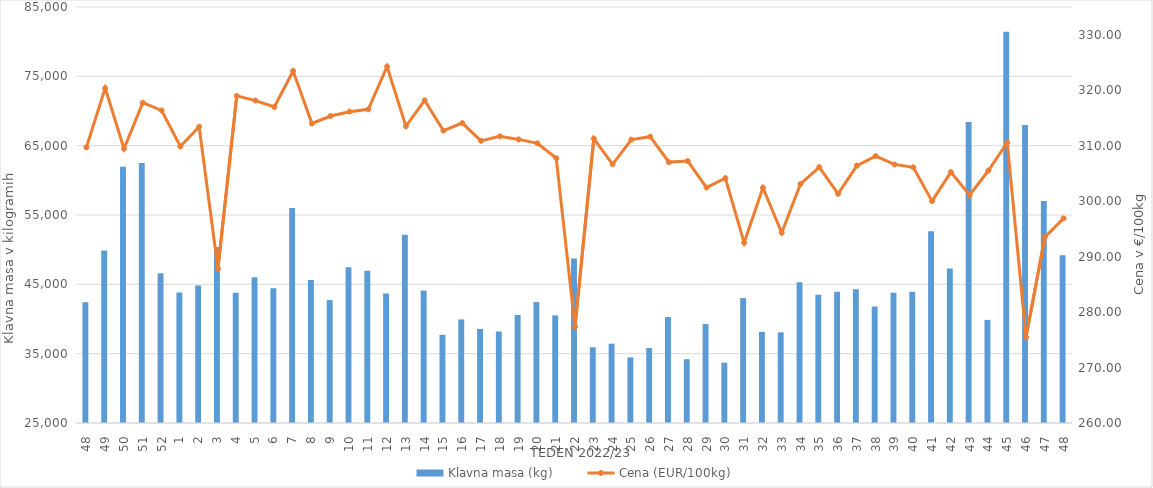
| Category | Klavna masa (kg) |
|---|---|
| 48.0 | 42416 |
| 49.0 | 49873 |
| 50.0 | 61942 |
| 51.0 | 62514 |
| 52.0 | 46589 |
| 1.0 | 43807 |
| 2.0 | 44834 |
| 3.0 | 50386 |
| 4.0 | 43773 |
| 5.0 | 46011 |
| 6.0 | 44439 |
| 7.0 | 56001 |
| 8.0 | 45613 |
| 9.0 | 42730 |
| 10.0 | 47471 |
| 11.0 | 46952 |
| 12.0 | 43683 |
| 13.0 | 52135 |
| 14.0 | 44103 |
| 15.0 | 37719 |
| 16.0 | 39943 |
| 17.0 | 38574 |
| 18.0 | 38200 |
| 19.0 | 40581 |
| 20.0 | 42443 |
| 21.0 | 40517 |
| 22.0 | 48742 |
| 23.0 | 35927 |
| 24.0 | 36436 |
| 25.0 | 34463 |
| 26.0 | 35812 |
| 27.0 | 40280 |
| 28.0 | 34201 |
| 29.0 | 39279 |
| 30.0 | 33702 |
| 31.0 | 43020 |
| 32.0 | 38146 |
| 33.0 | 38070 |
| 34.0 | 45290 |
| 35.0 | 43513 |
| 36.0 | 43945 |
| 37.0 | 44302 |
| 38.0 | 41798 |
| 39.0 | 43790 |
| 40.0 | 43913 |
| 41.0 | 52663 |
| 42.0 | 47275 |
| 43.0 | 68419 |
| 44.0 | 39872 |
| 45.0 | 81439 |
| 46.0 | 67983 |
| 47.0 | 57006 |
| 48.0 | 49204 |